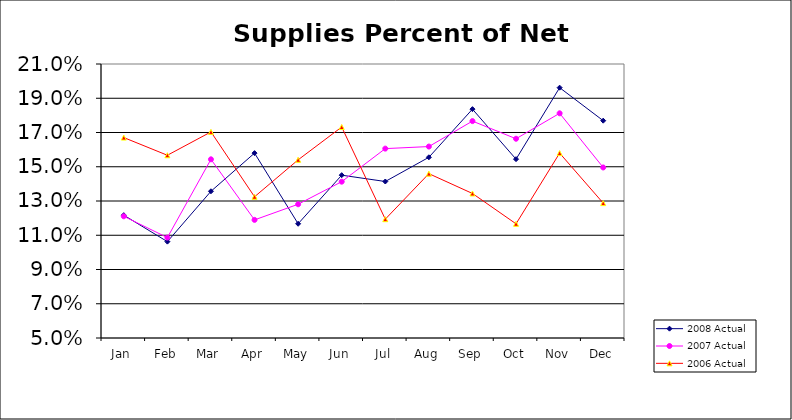
| Category | 2008 Actual | 2007 Actual | 2006 Actual |
|---|---|---|---|
| Jan | 0.122 | 0.121 | 0.167 |
| Feb | 0.106 | 0.109 | 0.157 |
| Mar | 0.136 | 0.154 | 0.17 |
| Apr | 0.158 | 0.119 | 0.132 |
| May | 0.117 | 0.128 | 0.154 |
| Jun | 0.145 | 0.141 | 0.173 |
| Jul | 0.141 | 0.161 | 0.119 |
| Aug | 0.156 | 0.162 | 0.146 |
| Sep | 0.184 | 0.177 | 0.134 |
| Oct | 0.154 | 0.166 | 0.117 |
| Nov | 0.196 | 0.181 | 0.158 |
| Dec | 0.177 | 0.15 | 0.129 |